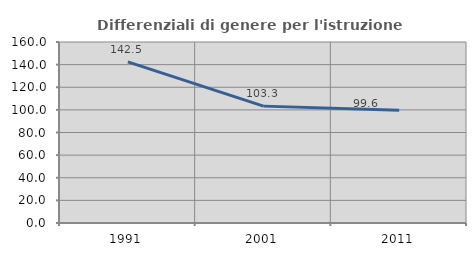
| Category | Differenziali di genere per l'istruzione superiore |
|---|---|
| 1991.0 | 142.452 |
| 2001.0 | 103.315 |
| 2011.0 | 99.593 |